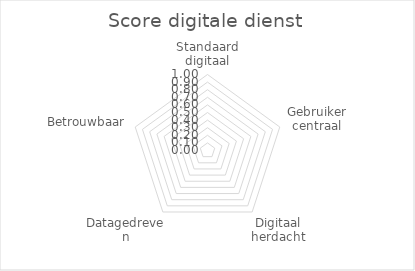
| Category | Series 0 |
|---|---|
| Standaard digitaal | 0 |
| Gebruiker centraal | 0 |
| Digitaal herdacht | 0 |
| Datagedreven | 0 |
| Betrouwbaar | 0 |